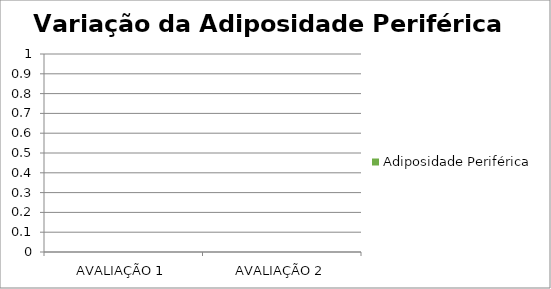
| Category | Adiposidade Periférica |
|---|---|
| AVALIAÇÃO 1 | 0 |
| AVALIAÇÃO 2 | 0 |